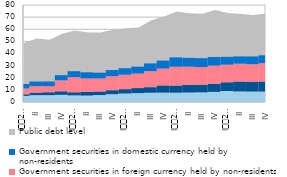
| Category | Government securities in domestic currency held by residents | Government securities in foreign currency held by residents | Government securities in foreign currency held by non-residents | Government securities in domestic currency held by non-residents |
|---|---|---|---|---|
| I
2012 | 5.04 | 1.302 | 4.866 | 3.62 |
| II | 5.662 | 2.072 | 5.31 | 3.854 |
| III | 5.686 | 2.381 | 5.014 | 3.854 |
| IV | 5.953 | 2.87 | 9.039 | 4.223 |
| I
2013 | 5.504 | 2.519 | 12.45 | 4.92 |
| II | 5.364 | 2.966 | 11.186 | 4.972 |
| III | 5.74 | 2.938 | 10.753 | 4.696 |
| IV | 6.478 | 3.253 | 11.554 | 5.079 |
| I
2014 | 7.047 | 3.555 | 11.898 | 5.337 |
| II | 7.319 | 4.16 | 12.026 | 5.613 |
| III | 7.663 | 4.578 | 13.233 | 6.359 |
| IV | 7.786 | 5.88 | 13.979 | 6.478 |
| I
2015 | 7.719 | 5.838 | 15.566 | 7.678 |
| II | 7.855 | 6.405 | 14.913 | 7.2 |
| III | 7.989 | 6.274 | 14.546 | 7.3 |
| IV | 8.364 | 6.618 | 15.046 | 7.118 |
| I
2016 | 9.055 | 7.216 | 14.547 | 6.404 |
| II | 8.736 | 8.093 | 14.774 | 5.994 |
| III | 8.647 | 8.021 | 14.495 | 6.395 |
| IV | 8.642 | 8.231 | 15.229 | 6.414 |